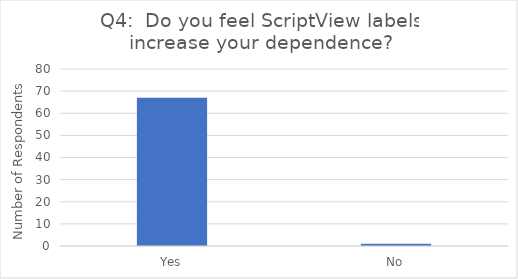
| Category | Series 0 |
|---|---|
| Yes | 67 |
| No | 1 |